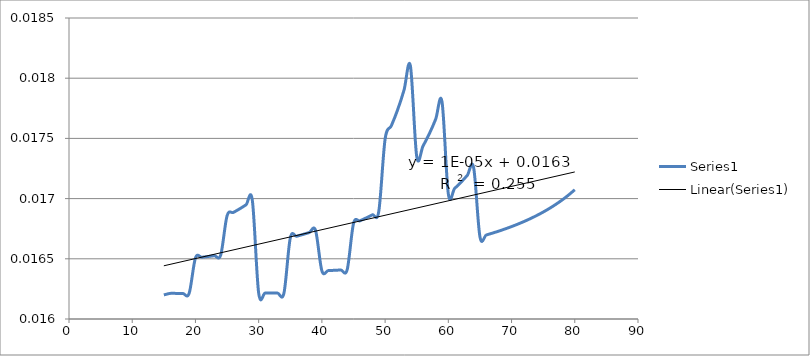
| Category | Series 0 |
|---|---|
| 15.0 | 0.016 |
| 16.0 | 0.016 |
| 17.0 | 0.016 |
| 18.0 | 0.016 |
| 19.0 | 0.016 |
| 20.0 | 0.017 |
| 21.0 | 0.017 |
| 22.0 | 0.017 |
| 23.0 | 0.017 |
| 24.0 | 0.017 |
| 25.0 | 0.017 |
| 26.0 | 0.017 |
| 27.0 | 0.017 |
| 28.0 | 0.017 |
| 29.0 | 0.017 |
| 30.0 | 0.016 |
| 31.0 | 0.016 |
| 32.0 | 0.016 |
| 33.0 | 0.016 |
| 34.0 | 0.016 |
| 35.0 | 0.017 |
| 36.0 | 0.017 |
| 37.0 | 0.017 |
| 38.0 | 0.017 |
| 39.0 | 0.017 |
| 40.0 | 0.016 |
| 41.0 | 0.016 |
| 42.0 | 0.016 |
| 43.0 | 0.016 |
| 44.0 | 0.016 |
| 45.0 | 0.017 |
| 46.0 | 0.017 |
| 47.0 | 0.017 |
| 48.0 | 0.017 |
| 49.0 | 0.017 |
| 50.0 | 0.017 |
| 51.0 | 0.018 |
| 52.0 | 0.018 |
| 53.0 | 0.018 |
| 54.0 | 0.018 |
| 55.0 | 0.017 |
| 56.0 | 0.017 |
| 57.0 | 0.018 |
| 58.0 | 0.018 |
| 59.0 | 0.018 |
| 60.0 | 0.017 |
| 61.0 | 0.017 |
| 62.0 | 0.017 |
| 63.0 | 0.017 |
| 64.0 | 0.017 |
| 65.0 | 0.017 |
| 66.0 | 0.017 |
| 67.0 | 0.017 |
| 68.0 | 0.017 |
| 69.0 | 0.017 |
| 70.0 | 0.017 |
| 71.0 | 0.017 |
| 72.0 | 0.017 |
| 73.0 | 0.017 |
| 74.0 | 0.017 |
| 75.0 | 0.017 |
| 76.0 | 0.017 |
| 77.0 | 0.017 |
| 78.0 | 0.017 |
| 79.0 | 0.017 |
| 80.0 | 0.017 |